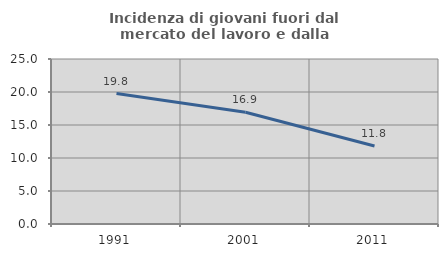
| Category | Incidenza di giovani fuori dal mercato del lavoro e dalla formazione  |
|---|---|
| 1991.0 | 19.757 |
| 2001.0 | 16.942 |
| 2011.0 | 11.818 |